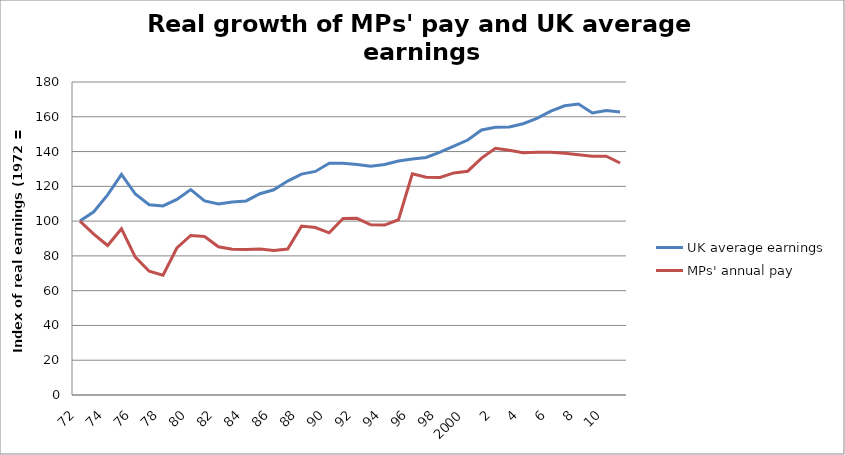
| Category | UK average earnings | MPs' annual pay |
|---|---|---|
| 72.0 | 100 | 100 |
| 73.0 | 105.378 | 92.506 |
| 74.0 | 115.1 | 85.959 |
| 75.0 | 126.888 | 95.611 |
| 76.0 | 115.559 | 79.333 |
| 77.0 | 109.424 | 71.174 |
| 78.0 | 108.724 | 68.867 |
| 79.0 | 112.488 | 84.541 |
| 80.0 | 118.135 | 91.752 |
| 81.0 | 111.655 | 91.172 |
| 82.0 | 109.828 | 85.237 |
| 83.0 | 111.007 | 83.813 |
| 84.0 | 111.609 | 83.644 |
| 85.0 | 115.739 | 83.946 |
| 86.0 | 118.036 | 83.076 |
| 87.0 | 123.036 | 83.95 |
| 88.0 | 127.02 | 97.125 |
| 89.0 | 128.579 | 96.304 |
| 90.0 | 133.344 | 93.279 |
| 91.0 | 133.306 | 101.552 |
| 92.0 | 132.577 | 101.594 |
| 93.0 | 131.569 | 97.914 |
| 94.0 | 132.545 | 97.746 |
| 95.0 | 134.547 | 100.784 |
| 96.0 | 135.717 | 127.172 |
| 97.0 | 136.585 | 125.184 |
| 98.0 | 139.641 | 125.137 |
| 99.0 | 143.192 | 127.7 |
| 2000.0 | 146.628 | 128.7 |
| 1.0 | 152.425 | 136.267 |
| 2.0 | 153.969 | 141.917 |
| 3.0 | 154.103 | 140.751 |
| 4.0 | 156.015 | 139.287 |
| 5.0 | 159.137 | 139.666 |
| 6.0 | 163.292 | 139.625 |
| 7.0 | 166.341 | 138.958 |
| 8.0 | 167.336 | 138.13 |
| 9.0 | 162.205 | 137.277 |
| 10.0 | 163.575 | 137.352 |
| 2011.0 | 162.776 | 133.434 |